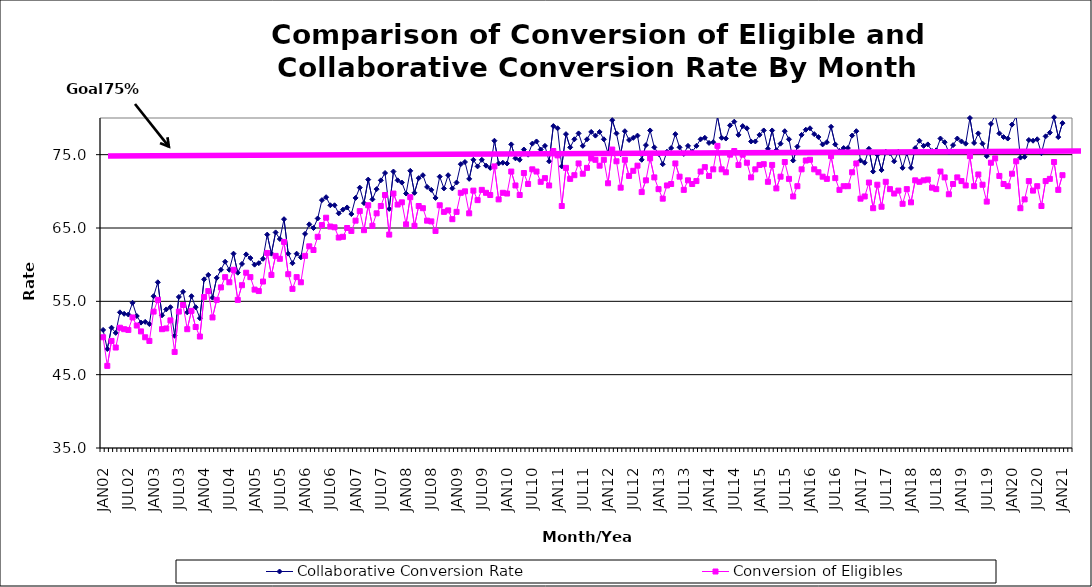
| Category | Collaborative Conversion Rate | Conversion of Eligibles |
|---|---|---|
| JAN02 | 51.1 | 50.1 |
| FEB02 | 48.5 | 46.2 |
| MAR02 | 51.4 | 49.6 |
| APR02 | 50.7 | 48.7 |
| MAY02 | 53.5 | 51.4 |
| JUN02 | 53.3 | 51.2 |
| JUL02 | 53.2 | 51.1 |
| AUG02 | 54.8 | 52.8 |
| SEP02 | 53 | 51.7 |
| OCT02 | 52.1 | 50.9 |
| NOV02 | 52.2 | 50.1 |
| DEC02 | 51.9 | 49.6 |
| JAN03 | 55.7 | 53.6 |
| FEB03 | 57.6 | 55.2 |
| MAR03 | 53.1 | 51.2 |
| APR03 | 53.9 | 51.3 |
| MAY03 | 54.2 | 52.4 |
| JUN03 | 50.3 | 48.1 |
| JUL03 | 55.6 | 53.6 |
| AUG03 | 56.3 | 54.5 |
| SEP03 | 53.5 | 51.2 |
| OCT03 | 55.7 | 53.7 |
| NOV03 | 54.2 | 51.5 |
| DEC03 | 52.7 | 50.2 |
| JAN04 | 58 | 55.6 |
| FEB04 | 58.6 | 56.4 |
| MAR04 | 55.5 | 52.8 |
| APR04 | 58.2 | 55.2 |
| MAY04 | 59.3 | 56.9 |
| JUN04 | 60.4 | 58.3 |
| JUL04 | 59.3 | 57.6 |
| AUG04 | 61.5 | 59.3 |
| SEP04 | 58.9 | 55.2 |
| OCT04 | 60.1 | 57.2 |
| NOV04 | 61.4 | 58.9 |
| DEC04 | 60.9 | 58.3 |
| JAN05 | 60 | 56.6 |
| FEB05 | 60.2 | 56.4 |
| MAR05 | 60.8 | 57.7 |
| APR05 | 64.1 | 61.6 |
| MAY05 | 61.5 | 58.6 |
| JUN05 | 64.4 | 61.2 |
| JUL05 | 63.5 | 60.8 |
| AUG05 | 66.2 | 63.1 |
| SEP05 | 61.5 | 58.7 |
| OCT05 | 60.2 | 56.7 |
| NOV05 | 61.5 | 58.3 |
| DEC05 | 61 | 57.6 |
| JAN06 | 64.2 | 61.2 |
| FEB06 | 65.5 | 62.5 |
| MAR06 | 65 | 62 |
| APR06 | 66.3 | 63.8 |
| MAY06 | 68.8 | 65.4 |
| JUN06 | 69.2 | 66.4 |
| JUL06 | 68.1 | 65.2 |
| AUG06 | 68.1 | 65.1 |
| SEP06 | 67 | 63.7 |
| OCT06 | 67.5 | 63.8 |
| NOV06 | 67.8 | 65 |
| DEC06 | 66.9 | 64.6 |
| JAN07 | 69.1 | 66 |
| FEB07 | 70.5 | 67.3 |
| MAR07 | 68.4 | 64.7 |
| APR07 | 71.6 | 68.1 |
| MAY07 | 68.9 | 65.3 |
| JUN07 | 70.3 | 67 |
| JUL07 | 71.5 | 68 |
| AUG07 | 72.5 | 69.5 |
| SEP07 | 67.6 | 64.1 |
| OCT07 | 72.7 | 69.7 |
| NOV07 | 71.5 | 68.2 |
| DEC07 | 71.2 | 68.5 |
| JAN08 | 69.7 | 65.5 |
| FEB08 | 72.8 | 69.2 |
| MAR08 | 69.8 | 65.3 |
| APR08 | 71.8 | 68 |
| MAY08 | 72.2 | 67.7 |
| JUN08 | 70.6 | 66 |
| JUL08 | 70.2 | 65.9 |
| AUG08 | 69.1 | 64.6 |
| SEP08 | 72 | 68.1 |
| OCT08 | 70.4 | 67.2 |
| NOV08 | 72.2 | 67.4 |
| DEC08 | 70.4 | 66.2 |
| JAN09 | 71.2 | 67.2 |
| FEB09 | 73.7 | 69.8 |
| MAR09 | 74 | 70 |
| APR09 | 71.7 | 67 |
| MAY09 | 74.3 | 70.1 |
| JUN09 | 73.4 | 68.8 |
| JUL09 | 74.3 | 70.2 |
| AUG09 | 73.5 | 69.8 |
| SEP09 | 73.2 | 69.5 |
| OCT09 | 76.9 | 73.4 |
| NOV09 | 73.8 | 68.9 |
| DEC09 | 73.9 | 69.8 |
| JAN10 | 73.8 | 69.7 |
| FEB10 | 76.4 | 72.7 |
| MAR10 | 74.5 | 70.8 |
| APR10 | 74.3 | 69.5 |
| MAY10 | 75.7 | 72.5 |
| JUN10 | 75 | 71 |
| JUL10 | 76.5 | 73 |
| AUG10 | 76.8 | 72.7 |
| SEP10 | 75.7 | 71.3 |
| OCT10 | 76.2 | 71.8 |
| NOV10 | 74.1 | 70.8 |
| DEC10 | 78.9 | 75.5 |
| JAN11 | 78.6 | 74.9 |
| FEB11 | 73.4 | 68 |
| MAR11 | 77.8 | 73.2 |
| APR11 | 76 | 71.7 |
| MAY11 | 77.1 | 72.2 |
| JUN11 | 77.9 | 73.8 |
| JUL11 | 76.2 | 72.4 |
| AUG11 | 77.1 | 73.2 |
| SEP11 | 78.1 | 74.5 |
| OCT11 | 77.6 | 74.3 |
| NOV11 | 78.1 | 73.5 |
| DEC11 | 77.1 | 74.3 |
| JAN12 | 75.2 | 71.1 |
| FEB12 | 79.7 | 75.7 |
| MAR12 | 77.9 | 74.1 |
| APR12 | 75.1 | 70.5 |
| MAY12 | 78.2 | 74.3 |
| JUN12 | 77 | 72.1 |
| JUL12 | 77.3 | 72.8 |
| AUG12 | 77.6 | 73.5 |
| SEP12 | 74.3 | 69.9 |
| OCT12 | 76.3 | 71.5 |
| NOV12 | 78.3 | 74.5 |
| DEC12 | 76 | 71.9 |
| JAN13 | 75.1 | 70.3 |
| FEB13 | 73.7 | 69 |
| MAR13 | 75.4 | 70.8 |
| APR13 | 75.9 | 71 |
| MAY13 | 77.8 | 73.8 |
| JUN13 | 76 | 72 |
| JUL13 | 75.1 | 70.2 |
| AUG13 | 76.2 | 71.5 |
| SEP13 | 75.4 | 71 |
| OCT13 | 76.2 | 71.4 |
| NOV13 | 77.1 | 72.7 |
| DEC13 | 77.3 | 73.3 |
| JAN14 | 76.6 | 72.1 |
| FEB14 | 76.7 | 73 |
| MAR14 | 80.2 | 76.2 |
| APR14 | 77.3 | 73 |
| MAY14 | 77.2 | 72.6 |
| JUN14 | 79 | 75 |
| JUL14 | 79.5 | 75.5 |
| AUG14 | 77.7 | 73.6 |
| SEP14 | 78.9 | 75 |
| OCT14 | 78.6 | 73.9 |
| NOV14 | 76.8 | 71.9 |
| DEC14 | 76.8 | 73 |
| JAN15 | 77.7 | 73.6 |
| FEB15 | 78.3 | 73.7 |
| MAR15 | 75.8 | 71.3 |
| APR15 | 78.3 | 73.6 |
| MAY15 | 75.6 | 70.4 |
| JUN15 | 76.5 | 72 |
| JUL15 | 78.2 | 74 |
| AUG15 | 77.1 | 71.7 |
| SEP15 | 74.2 | 69.3 |
| OCT15 | 76.1 | 70.7 |
| NOV15 | 77.7 | 73 |
| DEC15 | 78.4 | 74.2 |
| JAN16 | 78.6 | 74.3 |
| FEB16 | 77.8 | 73 |
| MAR16 | 77.4 | 72.6 |
| APR16 | 76.4 | 72 |
| MAY16 | 76.7 | 71.7 |
| JUN16 | 78.8 | 74.8 |
| JUL16 | 76.4 | 71.8 |
| AUG16 | 75.5 | 70.2 |
| SEP16 | 75.9 | 70.7 |
| OCT16 | 75.9 | 70.7 |
| NOV16 | 77.6 | 72.6 |
| DEC16 | 78.2 | 73.8 |
| JAN17 | 74.2 | 69 |
| FEB17 | 73.9 | 69.3 |
| MAR17 | 75.8 | 71.2 |
| APR17 | 72.7 | 67.7 |
| MAY17 | 75 | 70.9 |
| JUN17 | 72.9 | 67.9 |
| JUL17 | 75.4 | 71.3 |
| AUG17 | 75.2 | 70.3 |
| SEP17 | 74.1 | 69.7 |
| OCT17 | 75.4 | 70.1 |
| NOV17 | 73.2 | 68.3 |
| DEC17 | 75.2 | 70.3 |
| JAN18 | 73.2 | 68.5 |
| FEB18 | 75.9 | 71.5 |
| MAR18 | 76.9 | 71.3 |
| APR18 | 76.2 | 71.5 |
| MAY18 | 76.4 | 71.6 |
| JUN18 | 75.5 | 70.5 |
| JUL18 | 75.6 | 70.3 |
| AUG18 | 77.2 | 72.7 |
| SEP18 | 76.7 | 71.9 |
| OCT18 | 75.3 | 69.6 |
| NOV18 | 76.3 | 71 |
| DEC18 | 77.2 | 71.9 |
| JAN19 | 76.8 | 71.4 |
| FEB19 | 76.5 | 70.8 |
| MAR19 | 80 | 74.8 |
| APR19 | 76.6 | 70.7 |
| MAY19 | 77.9 | 72.3 |
| JUN19 | 76.5 | 70.9 |
| JUL19 | 74.8 | 68.6 |
| AUG19 | 79.2 | 73.9 |
| SEP19 | 80.4 | 74.5 |
| OCT19 | 77.9 | 72.1 |
| NOV19 | 77.4 | 71 |
| DEC19 | 77.2 | 70.7 |
| JAN20 | 79.1 | 72.4 |
| FEB20 | 80.2 | 74.1 |
| MAR20 | 74.6 | 67.7 |
| APR20 | 74.7 | 68.9 |
| MAY20 | 77 | 71.4 |
| JUN20 | 76.9 | 70.1 |
| JUL20 | 77.1 | 70.7 |
| AUG20 | 75.2 | 68 |
| SEP20 | 77.5 | 71.4 |
| OCT20 | 78 | 71.7 |
| NOV20 | 80.1 | 74 |
| DEC20 | 77.4 | 70.2 |
| JAN21 | 79.3 | 72.2 |